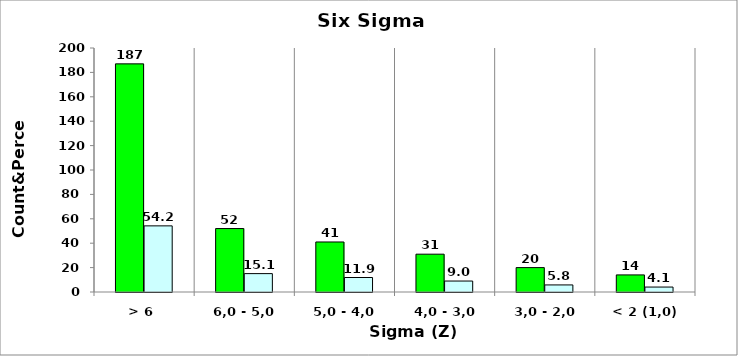
| Category | Count | Percent |
|---|---|---|
| > 6 | 187 | 54.203 |
| 6,0 - 5,0 | 52 | 15.072 |
| 5,0 - 4,0 | 41 | 11.884 |
| 4,0 - 3,0 | 31 | 8.986 |
| 3,0 - 2,0 | 20 | 5.797 |
| < 2 (1,0) | 14 | 4.058 |